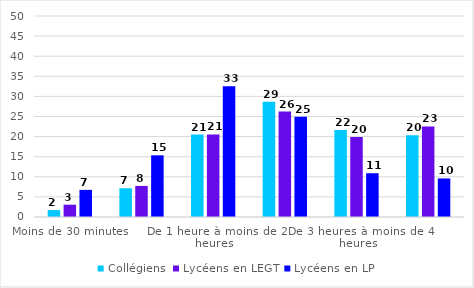
| Category | Collégiens | Lycéens en LEGT | Lycéens en LP |
|---|---|---|---|
| Moins de 30 minutes | 1.72 | 3.06 | 6.75 |
| De 30 minutes à moins d’une heure | 7.15 | 7.73 | 15.34 |
| De 1 heure à moins de 2 heures | 20.5 | 20.55 | 32.5 |
| De 2 heures à moins de 3 heures | 28.64 | 26.24 | 24.94 |
| De 3 heures à moins de 4 heures | 21.63 | 19.88 | 10.89 |
| 4 heures ou plus | 20.36 | 22.54 | 9.59 |